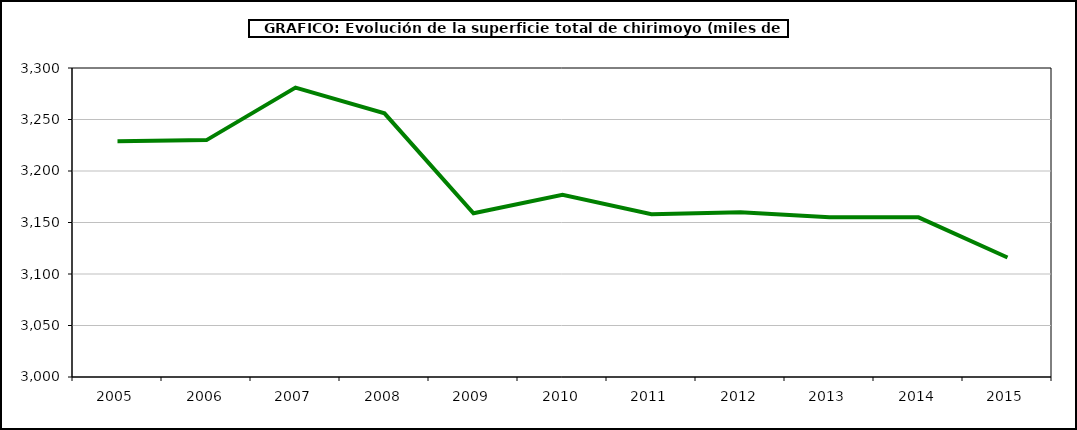
| Category | superficie chirimoyo |
|---|---|
| 2005.0 | 3229 |
| 2006.0 | 3230 |
| 2007.0 | 3281 |
| 2008.0 | 3256 |
| 2009.0 | 3159 |
| 2010.0 | 3177 |
| 2011.0 | 3158 |
| 2012.0 | 3160 |
| 2013.0 | 3155 |
| 2014.0 | 3155 |
| 2015.0 | 3116 |